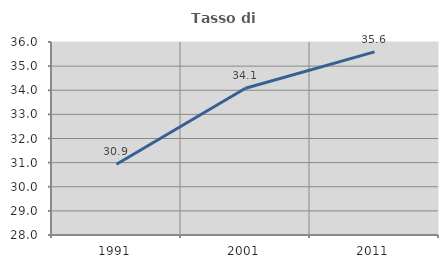
| Category | Tasso di occupazione   |
|---|---|
| 1991.0 | 30.933 |
| 2001.0 | 34.084 |
| 2011.0 | 35.589 |